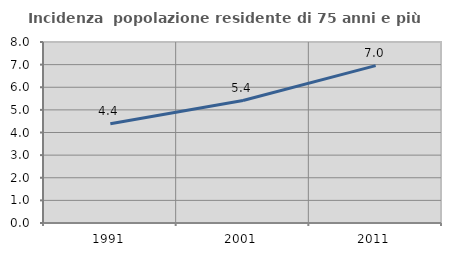
| Category | Incidenza  popolazione residente di 75 anni e più |
|---|---|
| 1991.0 | 4.384 |
| 2001.0 | 5.412 |
| 2011.0 | 6.956 |